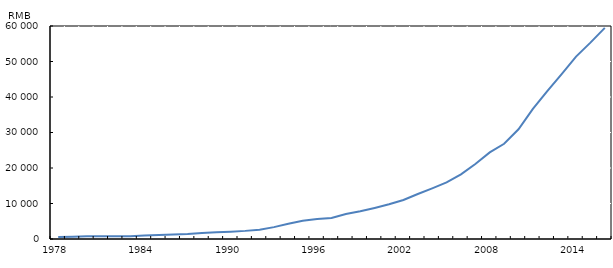
| Category | Salaires du secteur manufacturier |
|---|---|
| 1978.0 | 597 |
| 1979.0 | 664 |
| 1980.0 | 752 |
| 1981.0 | 758 |
| 1982.0 | 773 |
| 1983.0 | 789 |
| 1984.0 | 955 |
| 1985.0 | 1112 |
| 1986.0 | 1275 |
| 1987.0 | 1418 |
| 1988.0 | 1710 |
| 1989.0 | 1900 |
| 1990.0 | 2073 |
| 1991.0 | 2289 |
| 1992.0 | 2635 |
| 1993.0 | 3348 |
| 1994.0 | 4283 |
| 1995.0 | 5169 |
| 1996.0 | 5642 |
| 1997.0 | 5933 |
| 1998.0 | 7064 |
| 1999.0 | 7794 |
| 2000.0 | 8750 |
| 2001.0 | 9774 |
| 2002.0 | 11001 |
| 2003.0 | 12671 |
| 2004.0 | 14251 |
| 2005.0 | 15934 |
| 2006.0 | 18225 |
| 2007.0 | 21144 |
| 2008.0 | 24404 |
| 2009.0 | 26810 |
| 2010.0 | 30916 |
| 2011.0 | 36665 |
| 2012.0 | 41650 |
| 2013.0 | 46431 |
| 2014.0 | 51369 |
| 2015.0 | 55324 |
| 2016.0 | 59470 |